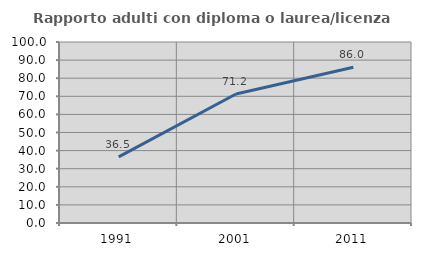
| Category | Rapporto adulti con diploma o laurea/licenza media  |
|---|---|
| 1991.0 | 36.533 |
| 2001.0 | 71.243 |
| 2011.0 | 86.006 |